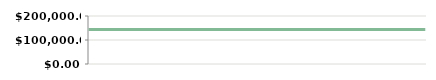
| Category | YEAR   |
|---|---|
| 2013-04-23 | 143800 |
| 2013-04-25 | 143800 |
| 2013-05-07 | 143800 |
| 2013-05-14 | 143800 |
| 2013-05-14 | 143800 |
| 2013-05-29 | 143800 |
| 2013-06-10 | 143800 |
| 2013-06-21 | 143800 |
| 2013-07-06 | 143800 |
| 2013-08-05 | 143800 |
| 2013-08-19 | 143800 |
| 2013-09-04 | 143800 |
| 2013-09-20 | 143800 |
| 2013-09-25 | 143800 |
| 2013-10-15 | 143800 |
| 2013-11-05 | 143800 |
| 2013-11-26 | 143800 |
| 2013-11-30 | 143800 |
| 2013-12-11 | 143800 |